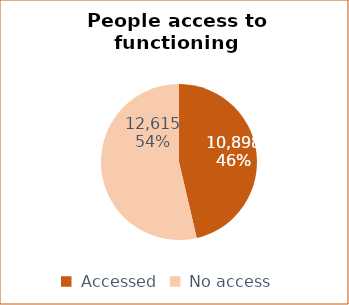
| Category |  # in villages (6:1)  |
|---|---|
|  Accessed   | 10898 |
|  No access   | 12615 |